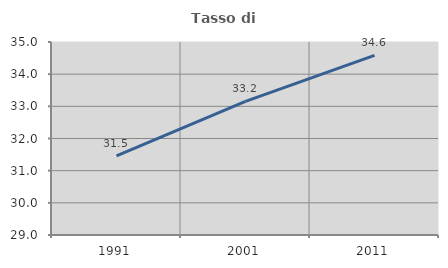
| Category | Tasso di occupazione   |
|---|---|
| 1991.0 | 31.462 |
| 2001.0 | 33.153 |
| 2011.0 | 34.586 |